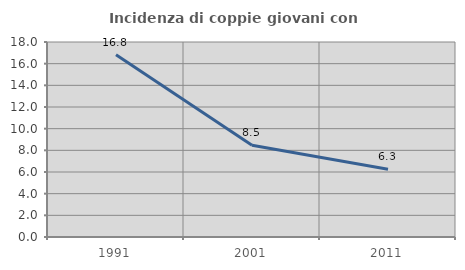
| Category | Incidenza di coppie giovani con figli |
|---|---|
| 1991.0 | 16.814 |
| 2001.0 | 8.475 |
| 2011.0 | 6.25 |